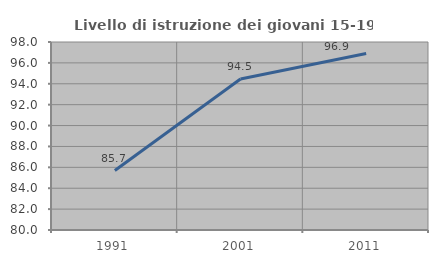
| Category | Livello di istruzione dei giovani 15-19 anni |
|---|---|
| 1991.0 | 85.696 |
| 2001.0 | 94.46 |
| 2011.0 | 96.902 |